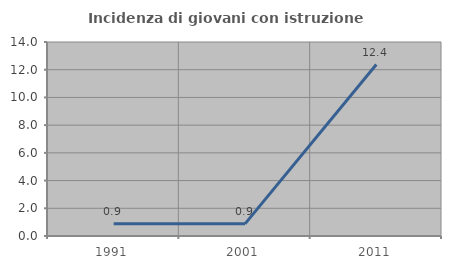
| Category | Incidenza di giovani con istruzione universitaria |
|---|---|
| 1991.0 | 0.885 |
| 2001.0 | 0.877 |
| 2011.0 | 12.371 |